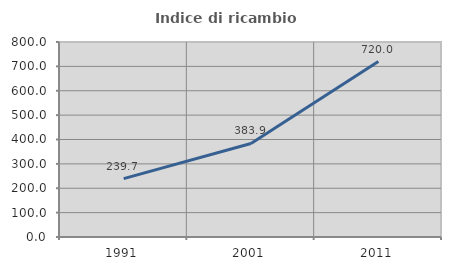
| Category | Indice di ricambio occupazionale  |
|---|---|
| 1991.0 | 239.683 |
| 2001.0 | 383.871 |
| 2011.0 | 720 |